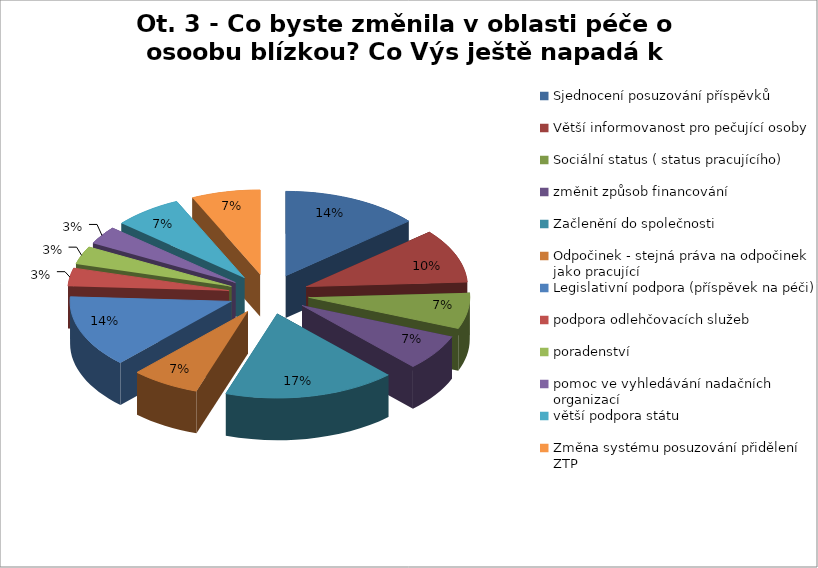
| Category | Ot. 3 - Co byste změnila v oblasti péče o osoobu blízkou? Co Výs ještě napadá k tomuto tématu? % |
|---|---|
| Sjednocení posuzování příspěvků | 0.138 |
| Větší informovanost pro pečující osoby | 0.103 |
| Sociální status ( status pracujícího) | 0.069 |
| změnit způsob financování | 0.069 |
| Začlenění do společnosti | 0.172 |
| Odpočinek - stejná práva na odpočinek jako pracující | 0.069 |
| Legislativní podpora (příspěvek na péči) | 0.138 |
| podpora odlehčovacích služeb | 0.034 |
| poradenství  | 0.034 |
| pomoc ve vyhledávání nadačních organizací | 0.034 |
| větší podpora státu | 0.069 |
| Změna systému posuzování přidělení ZTP | 0.069 |